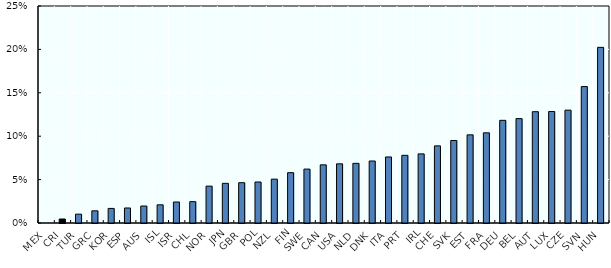
| Category | Series 0 |
|---|---|
| MEX | 0 |
| CRI | 0.005 |
| TUR | 0.01 |
| GRC | 0.014 |
| KOR | 0.017 |
| ESP | 0.017 |
| AUS | 0.02 |
| ISL | 0.021 |
| ISR | 0.024 |
| CHL | 0.025 |
| NOR | 0.042 |
| JPN | 0.046 |
| GBR | 0.046 |
| POL | 0.047 |
| NZL | 0.051 |
| FIN | 0.058 |
| SWE | 0.062 |
| CAN | 0.067 |
| USA | 0.068 |
| NLD | 0.069 |
| DNK | 0.071 |
| ITA | 0.076 |
| PRT | 0.078 |
| IRL | 0.08 |
| CHE | 0.089 |
| SVK | 0.095 |
| EST | 0.102 |
| FRA | 0.104 |
| DEU | 0.118 |
| BEL | 0.12 |
| AUT | 0.128 |
| LUX | 0.128 |
| CZE | 0.13 |
| SVN | 0.157 |
| HUN | 0.202 |